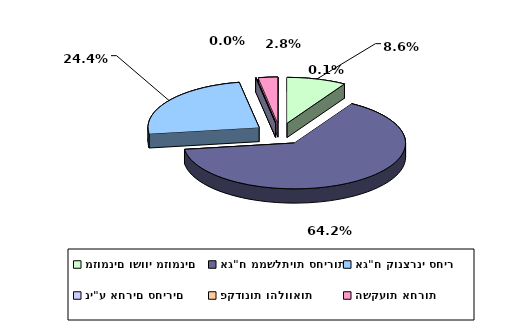
| Category | Series 0 |
|---|---|
| מזומנים ושווי מזומנים | 0.086 |
| אג"ח ממשלתיות סחירות | 0.642 |
| אג"ח קונצרני סחיר | 0.244 |
| ני"ע אחרים סחירים | 0.001 |
| פקדונות והלוואות | 0 |
| השקעות אחרות | 0.028 |